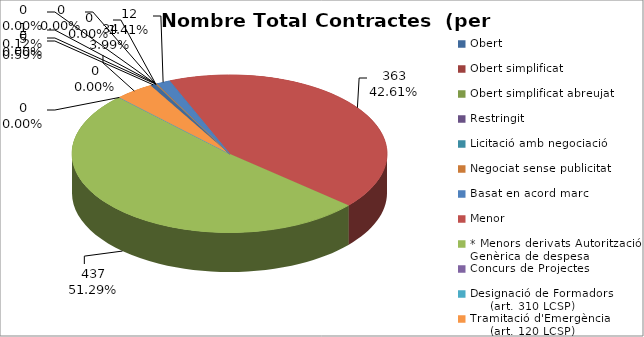
| Category | Nombre Total Contractes |
|---|---|
| Obert | 5 |
| Obert simplificat | 0 |
| Obert simplificat abreujat | 0 |
| Restringit | 0 |
| Licitació amb negociació | 0 |
| Negociat sense publicitat | 1 |
| Basat en acord marc | 12 |
| Menor | 363 |
| * Menors derivats Autorització Genèrica de despesa | 437 |
| Concurs de Projectes | 0 |
| Designació de Formadors
     (art. 310 LCSP) | 0 |
| Tramitació d'Emergència
     (art. 120 LCSP) | 34 |